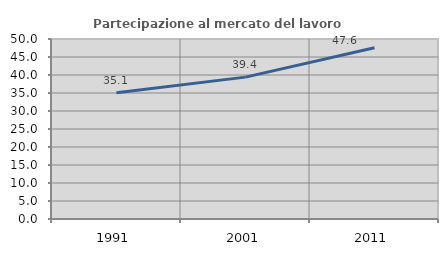
| Category | Partecipazione al mercato del lavoro  femminile |
|---|---|
| 1991.0 | 35.058 |
| 2001.0 | 39.412 |
| 2011.0 | 47.566 |